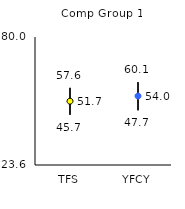
| Category | 25th | 75th | Mean |
|---|---|---|---|
| TFS | 45.7 | 57.6 | 51.72 |
| YFCY | 47.7 | 60.1 | 54 |